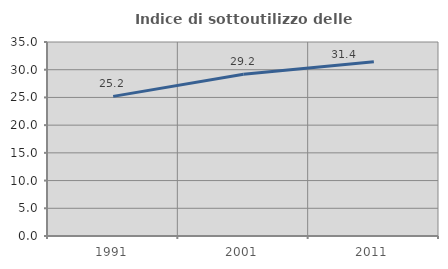
| Category | Indice di sottoutilizzo delle abitazioni  |
|---|---|
| 1991.0 | 25.191 |
| 2001.0 | 29.175 |
| 2011.0 | 31.449 |